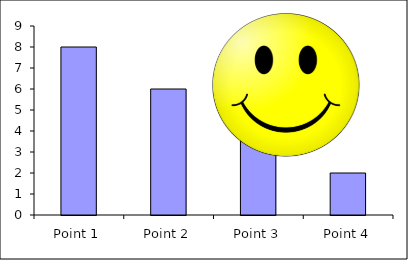
| Category | Series 1 |
|---|---|
| Point 1 | 8 |
| Point 2 | 6 |
| Point 3 | 4 |
| Point 4 | 2 |